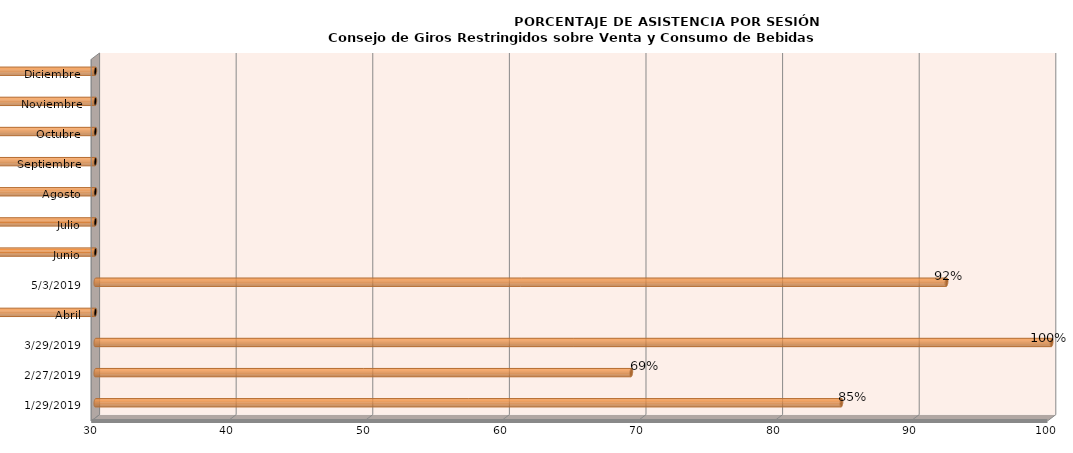
| Category | Series 0 |
|---|---|
| 29/01/2019 | 84.615 |
| 27/02/2019 | 69.231 |
| 29/03/2019 | 100 |
| Abril | 0 |
| 03/05/2019 | 92.308 |
| Junio | 0 |
| Julio | 0 |
| Agosto | 0 |
| Septiembre | 0 |
| Octubre | 0 |
| Noviembre | 0 |
| Diciembre | 0 |